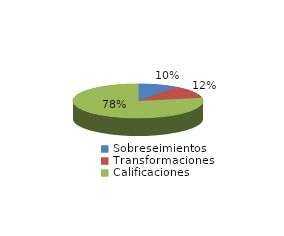
| Category | Series 0 |
|---|---|
| Sobreseimientos | 149 |
| Transformaciones | 178 |
| Calificaciones | 1160 |